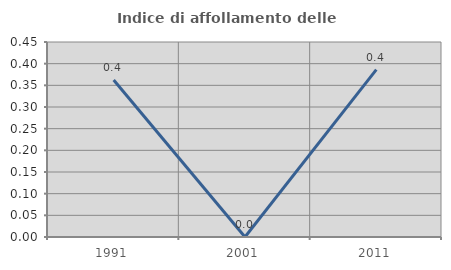
| Category | Indice di affollamento delle abitazioni  |
|---|---|
| 1991.0 | 0.362 |
| 2001.0 | 0 |
| 2011.0 | 0.386 |